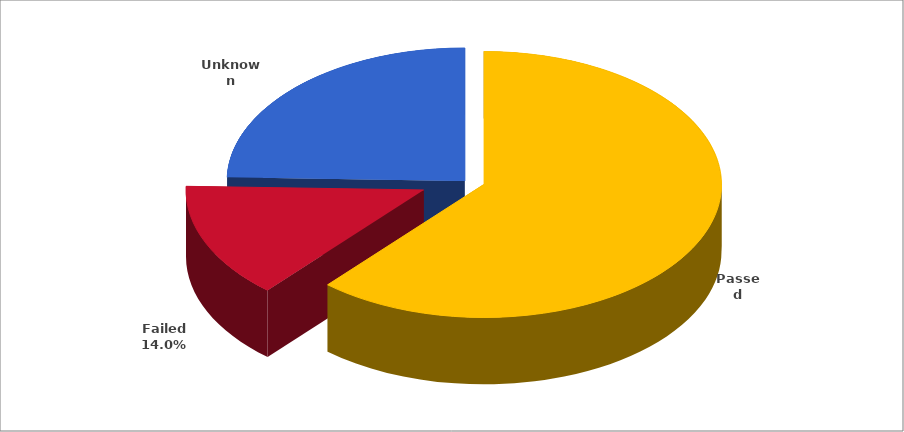
| Category | Series 0 |
|---|---|
| 0 | 0.614 |
| 1 | 0.14 |
| 2 | 0.246 |